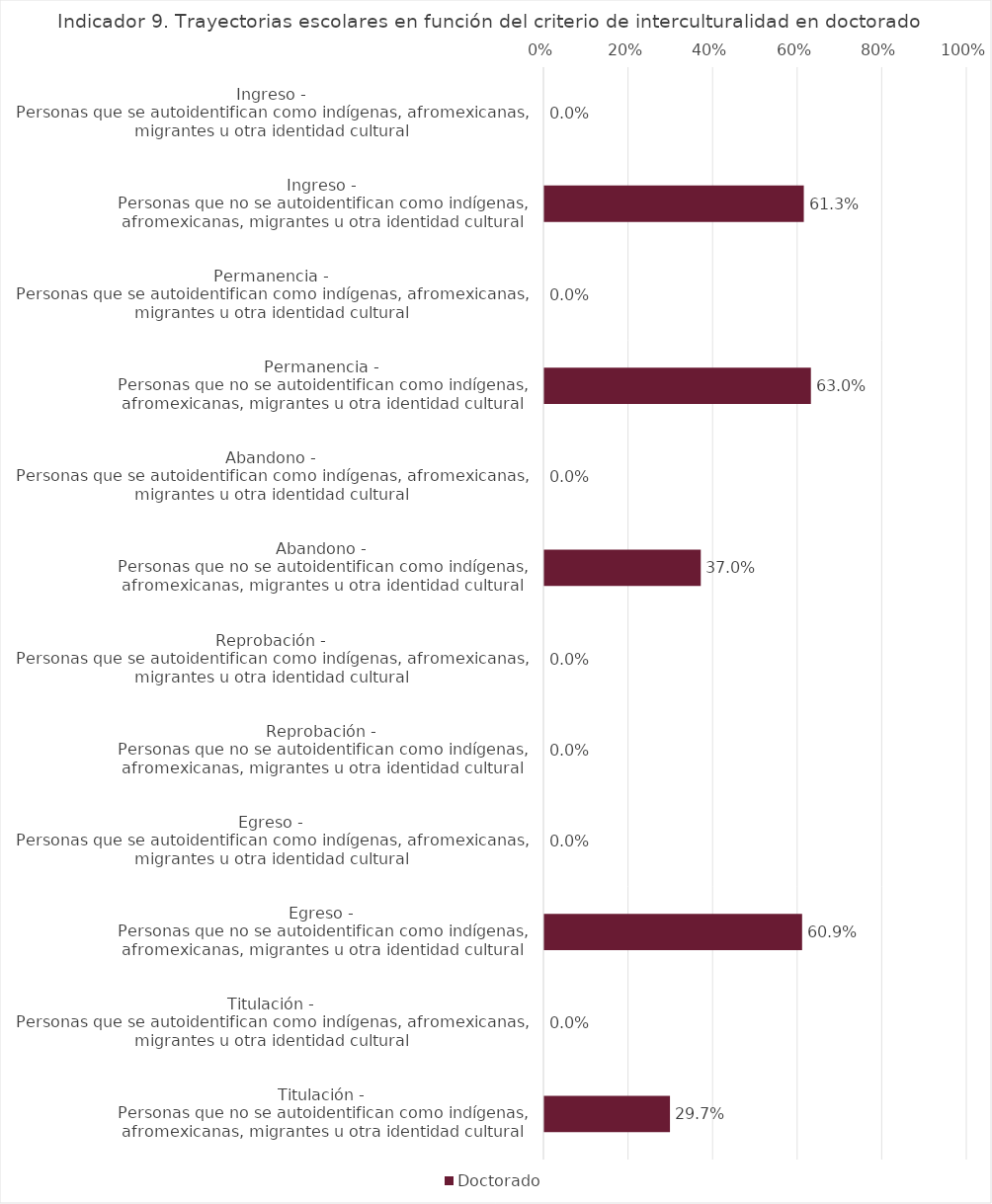
| Category | Doctorado |
|---|---|
| Ingreso - 
Personas que se autoidentifican como indígenas, afromexicanas, migrantes u otra identidad cultural | 0 |
| Ingreso - 
Personas que no se autoidentifican como indígenas, afromexicanas, migrantes u otra identidad cultural | 0.613 |
| Permanencia - 
Personas que se autoidentifican como indígenas, afromexicanas, migrantes u otra identidad cultural | 0 |
| Permanencia - 
Personas que no se autoidentifican como indígenas, afromexicanas, migrantes u otra identidad cultural | 0.63 |
| Abandono - 
Personas que se autoidentifican como indígenas, afromexicanas, migrantes u otra identidad cultural | 0 |
| Abandono - 
Personas que no se autoidentifican como indígenas, afromexicanas, migrantes u otra identidad cultural | 0.37 |
| Reprobación - 
Personas que se autoidentifican como indígenas, afromexicanas, migrantes u otra identidad cultural | 0 |
| Reprobación - 
Personas que no se autoidentifican como indígenas, afromexicanas, migrantes u otra identidad cultural | 0 |
| Egreso - 
Personas que se autoidentifican como indígenas, afromexicanas, migrantes u otra identidad cultural | 0 |
| Egreso - 
Personas que no se autoidentifican como indígenas, afromexicanas, migrantes u otra identidad cultural | 0.609 |
| Titulación - 
Personas que se autoidentifican como indígenas, afromexicanas, migrantes u otra identidad cultural | 0 |
| Titulación - 
Personas que no se autoidentifican como indígenas, afromexicanas, migrantes u otra identidad cultural | 0.297 |